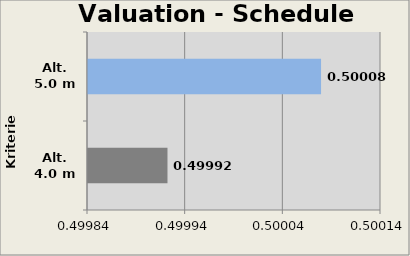
| Category | Valuation Schedule Module  |
|---|---|
| Alt. 4.0 m | 0.5 |
| Alt. 5.0 m | 0.5 |